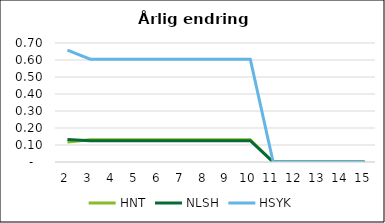
| Category | HNT | NLSH | HSYK |
|---|---|---|---|
| 2.0 | 0.118 | 0.132 | 0.659 |
| 3.0 | 0.131 | 0.125 | 0.604 |
| 4.0 | 0.131 | 0.125 | 0.604 |
| 5.0 | 0.131 | 0.125 | 0.604 |
| 6.0 | 0.131 | 0.125 | 0.604 |
| 7.0 | 0.131 | 0.125 | 0.604 |
| 8.0 | 0.131 | 0.125 | 0.604 |
| 9.0 | 0.131 | 0.125 | 0.604 |
| 10.0 | 0.131 | 0.125 | 0.604 |
| 11.0 | 0 | 0 | 0 |
| 12.0 | 0 | 0 | 0 |
| 13.0 | 0 | 0 | 0 |
| 14.0 | 0 | 0 | 0 |
| 15.0 | 0 | 0 | 0 |